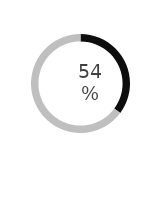
| Category | Series 0 |
|---|---|
| Männer | 0.542 |
| Prozent | 1 |